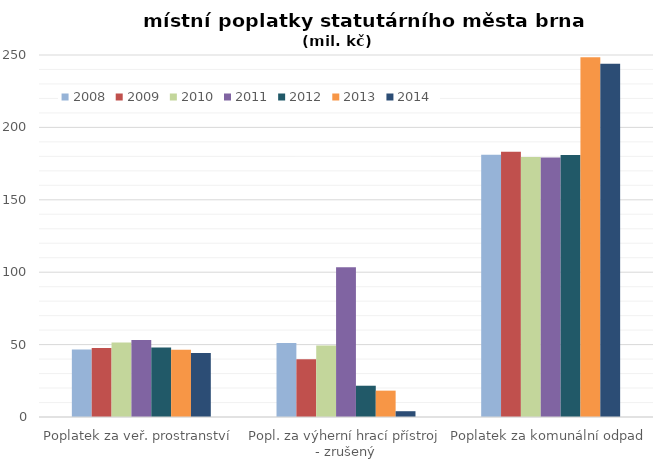
| Category | 2008 | 2009 | 2010 | 2011 | 2012 | 2013 | 2014 |
|---|---|---|---|---|---|---|---|
| Poplatek za veř. prostranství | 46.6 | 47.6 | 51.4 | 53.1 | 48 | 46.5 | 44.2 |
| Popl. za výherní hrací přístroj - zrušený | 51.1 | 39.9 | 49.4 | 103.4 | 21.6 | 18.2 | 4 |
| Poplatek za komunální odpad | 181.055 | 183.134 | 179.567 | 179.222 | 180.892 | 248.4 | 243.9 |